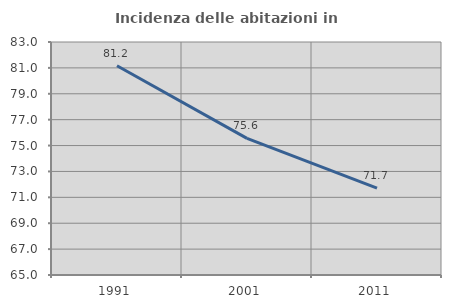
| Category | Incidenza delle abitazioni in proprietà  |
|---|---|
| 1991.0 | 81.17 |
| 2001.0 | 75.551 |
| 2011.0 | 71.716 |